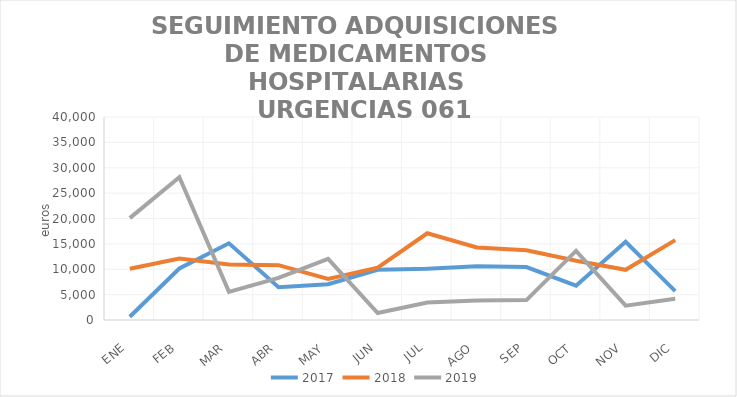
| Category | 2017 | 2018 | 2019 |
|---|---|---|---|
| ENE | 635.23 | 10093.46 | 20076.45 |
| FEB | 10148.89 | 12093.36 | 28130.76 |
| MAR | 15111.73 | 10960.12 | 5542.79 |
| ABR | 6467.73 | 10800.27 | 8289.41 |
| MAY | 7049.36 | 8094.9 | 12058.4 |
| JUN | 9878.94 | 10310.99 | 1365.55 |
| JUL | 10101.03 | 17095.54 | 3453.17 |
| AGO | 10575.3 | 14284.15 | 3837.16 |
| SEP | 10432.45 | 13746.39 | 3929.38 |
| OCT | 6760.3 | 11683.32 | 13617.93 |
| NOV | 15407.72 | 9895.42 | 2830.96 |
| DIC | 5703.07 | 15732.54 | 4167.98 |